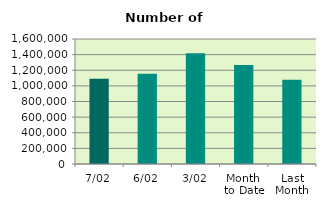
| Category | Series 0 |
|---|---|
| 7/02 | 1091114 |
| 6/02 | 1156558 |
| 3/02 | 1418904 |
| Month 
to Date | 1267540.8 |
| Last
Month | 1077187.636 |